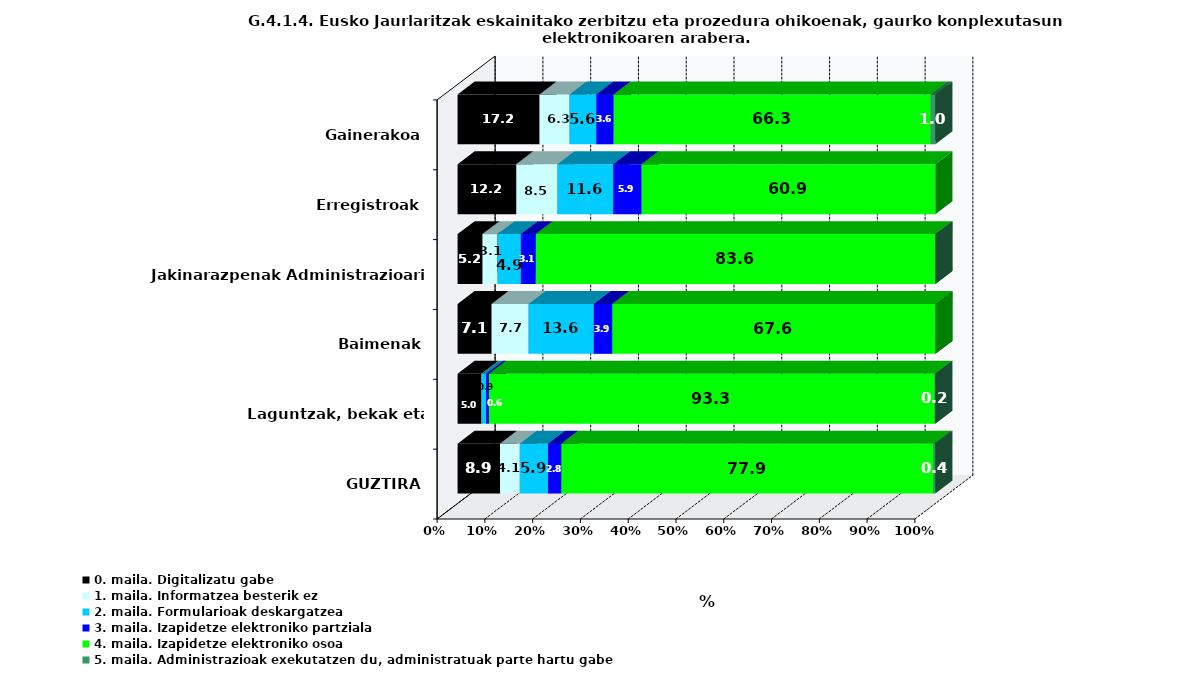
| Category | 0. maila. Digitalizatu gabe | 1. maila. Informatzea besterik ez | 2. maila. Formularioak deskargatzea | 3. maila. Izapidetze elektroniko partziala | 4. maila. Izapidetze elektroniko osoa | 5. maila. Administrazioak exekutatzen du, administratuak parte hartu gabe |
|---|---|---|---|---|---|---|
| GUZTIRA | 8.885 | 4.136 | 5.913 | 2.779 | 77.868 | 0.42 |
| Laguntzak, bekak eta diru-laguntzak | 5.008 | 0.082 | 0.903 | 0.575 | 93.268 | 0.164 |
| Baimenak | 7.128 | 7.739 | 13.646 | 3.87 | 67.617 | 0 |
| Jakinarazpenak Administrazioari | 5.226 | 3.136 | 4.878 | 3.136 | 83.624 | 0 |
| Erregistroak | 12.17 | 8.519 | 11.562 | 5.882 | 60.852 | 0 |
| Gainerakoa | 17.162 | 6.271 | 5.611 | 3.63 | 66.337 | 0.99 |